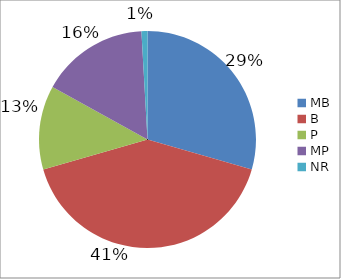
| Category | Series 0 |
|---|---|
| MB | 0.295 |
| B | 0.411 |
| P | 0.125 |
| MP | 0.161 |
| NR | 0.009 |